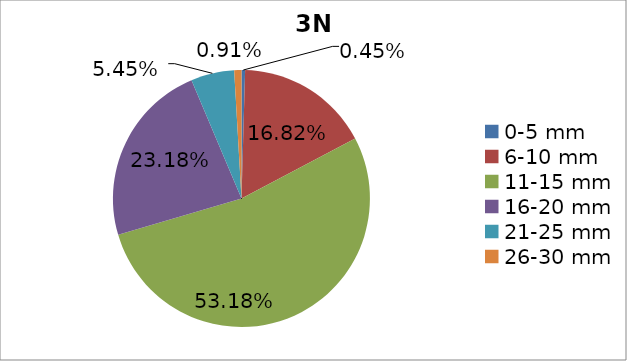
| Category | Series 0 |
|---|---|
| 0-5 mm | 0.004 |
| 6-10 mm | 0.168 |
| 11-15 mm | 0.532 |
| 16-20 mm | 0.232 |
| 21-25 mm | 0.054 |
| 26-30 mm | 0.009 |